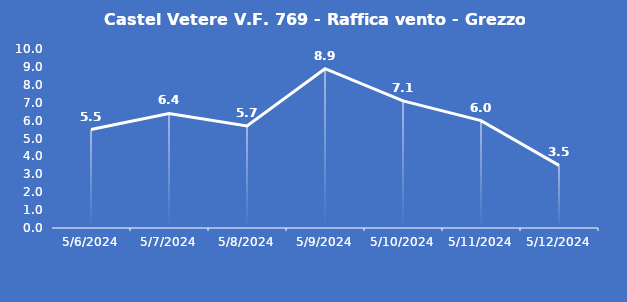
| Category | Castel Vetere V.F. 769 - Raffica vento - Grezzo (m/s) |
|---|---|
| 5/6/24 | 5.5 |
| 5/7/24 | 6.4 |
| 5/8/24 | 5.7 |
| 5/9/24 | 8.9 |
| 5/10/24 | 7.1 |
| 5/11/24 | 6 |
| 5/12/24 | 3.5 |